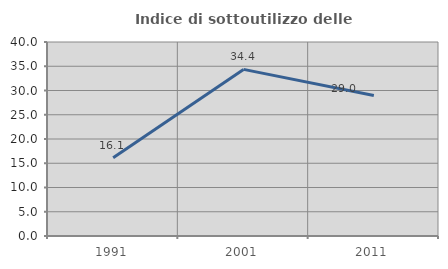
| Category | Indice di sottoutilizzo delle abitazioni  |
|---|---|
| 1991.0 | 16.129 |
| 2001.0 | 34.351 |
| 2011.0 | 28.966 |